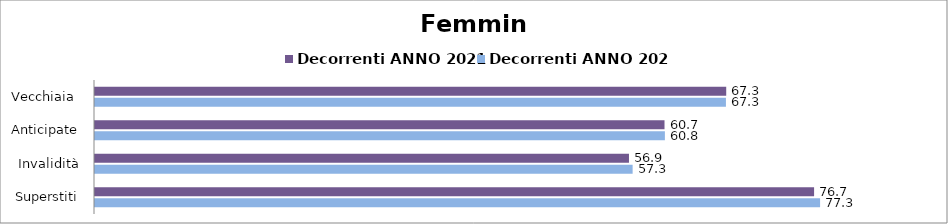
| Category | Decorrenti ANNO 2021 | Decorrenti ANNO 2022 |
|---|---|---|
| Vecchiaia  | 67.31 | 67.28 |
| Anticipate | 60.73 | 60.77 |
| Invalidità | 56.94 | 57.33 |
| Superstiti | 76.68 | 77.32 |